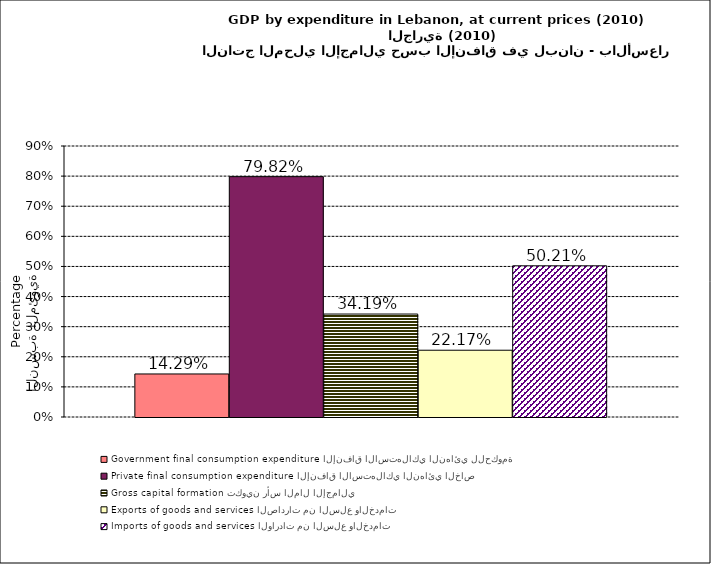
| Category | Government final consumption expenditure الإنفاق الاستهلاكي النهائي للحكومة | Private final consumption expenditure الإنفاق الاستهلاكي النهائي الخاص | Gross capital formation تكوين رأس المال الإجمالي | Exports of goods and services الصادرات من السلع والخدمات | Imports of goods and services الواردات من السلع والخدمات |
|---|---|---|---|---|---|
| 0 | 0.143 | 0.798 | 0.342 | 0.222 | 0.502 |